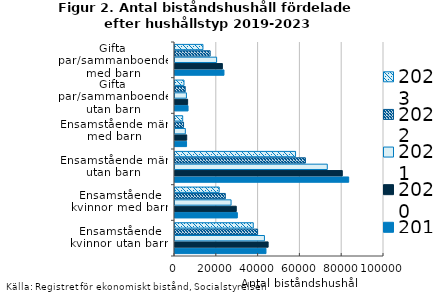
| Category | 2019 | 2020 | 2021 | 2022 | 2023 |
|---|---|---|---|---|---|
| Ensamstående kvinnor utan barn | 43526 | 44563 | 42786 | 39516 | 37443 |
| Ensamstående kvinnor med barn | 29830 | 29319 | 26831 | 24073 | 21144 |
| Ensamstående män utan barn | 83103 | 80047 | 72863 | 62401 | 57680 |
| Ensamstående män med barn | 5532 | 5601 | 4946 | 4094 | 3683 |
| Gifta par/sammanboende utan barn | 6244 | 6045 | 5469 | 4901 | 4301 |
| Gifta par/sammanboende med barn | 23425 | 22674 | 19914 | 16819 | 13368 |